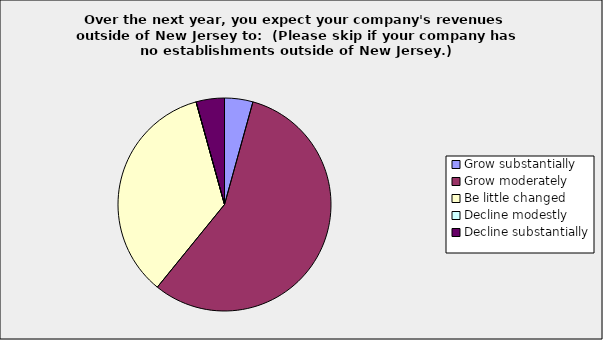
| Category | Series 0 |
|---|---|
| Grow substantially | 0.043 |
| Grow moderately | 0.565 |
| Be little changed | 0.348 |
| Decline modestly | 0 |
| Decline substantially | 0.043 |